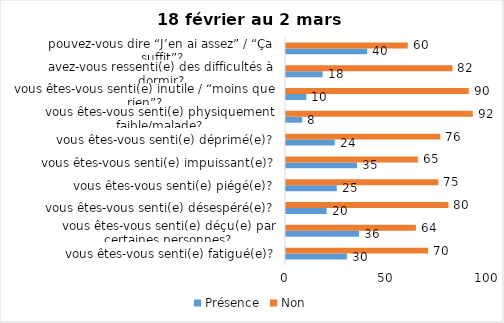
| Category | Présence | Non |
|---|---|---|
| vous êtes-vous senti(e) fatigué(e)? | 30 | 70 |
| vous êtes-vous senti(e) déçu(e) par certaines personnes? | 36 | 64 |
| vous êtes-vous senti(e) désespéré(e)? | 20 | 80 |
| vous êtes-vous senti(e) piégé(e)? | 25 | 75 |
| vous êtes-vous senti(e) impuissant(e)? | 35 | 65 |
| vous êtes-vous senti(e) déprimé(e)? | 24 | 76 |
| vous êtes-vous senti(e) physiquement faible/malade? | 8 | 92 |
| vous êtes-vous senti(e) inutile / “moins que rien”? | 10 | 90 |
| avez-vous ressenti(e) des difficultés à dormir? | 18 | 82 |
| pouvez-vous dire “J’en ai assez” / “Ça suffit”? | 40 | 60 |